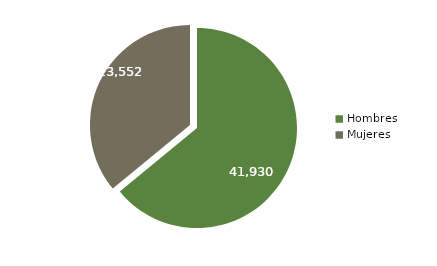
| Category | Series 0 |
|---|---|
| Hombres | 41930 |
| Mujeres | 23552 |